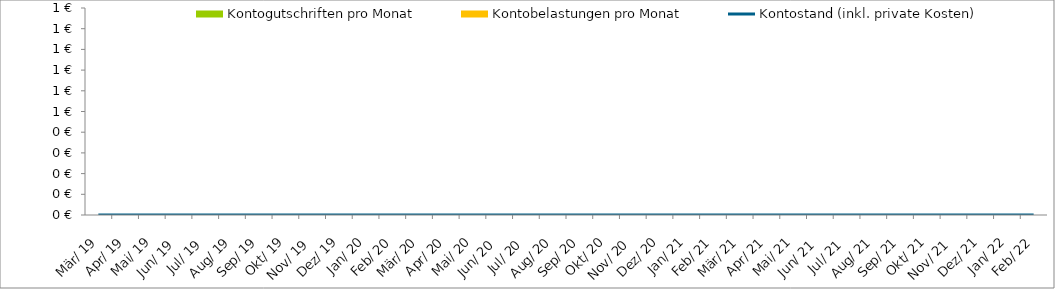
| Category | Kontogutschriften pro Monat | Kontobelastungen pro Monat |
|---|---|---|
| 2019-03-01 | 0 | 0 |
| 2019-04-01 | 0 | 0 |
| 2019-05-01 | 0 | 0 |
| 2019-06-01 | 0 | 0 |
| 2019-07-01 | 0 | 0 |
| 2019-08-01 | 0 | 0 |
| 2019-09-01 | 0 | 0 |
| 2019-10-01 | 0 | 0 |
| 2019-11-01 | 0 | 0 |
| 2019-12-01 | 0 | 0 |
| 2020-01-01 | 0 | 0 |
| 2020-02-01 | 0 | 0 |
| 2020-03-01 | 0 | 0 |
| 2020-04-01 | 0 | 0 |
| 2020-05-01 | 0 | 0 |
| 2020-06-01 | 0 | 0 |
| 2020-07-01 | 0 | 0 |
| 2020-08-01 | 0 | 0 |
| 2020-09-01 | 0 | 0 |
| 2020-10-01 | 0 | 0 |
| 2020-11-01 | 0 | 0 |
| 2020-12-01 | 0 | 0 |
| 2021-01-01 | 0 | 0 |
| 2021-02-01 | 0 | 0 |
| 2021-03-01 | 0 | 0 |
| 2021-04-01 | 0 | 0 |
| 2021-05-01 | 0 | 0 |
| 2021-06-01 | 0 | 0 |
| 2021-07-01 | 0 | 0 |
| 2021-08-01 | 0 | 0 |
| 2021-09-01 | 0 | 0 |
| 2021-10-01 | 0 | 0 |
| 2021-11-01 | 0 | 0 |
| 2021-12-01 | 0 | 0 |
| 2022-01-01 | 0 | 0 |
| 2022-02-01 | 0 | 0 |